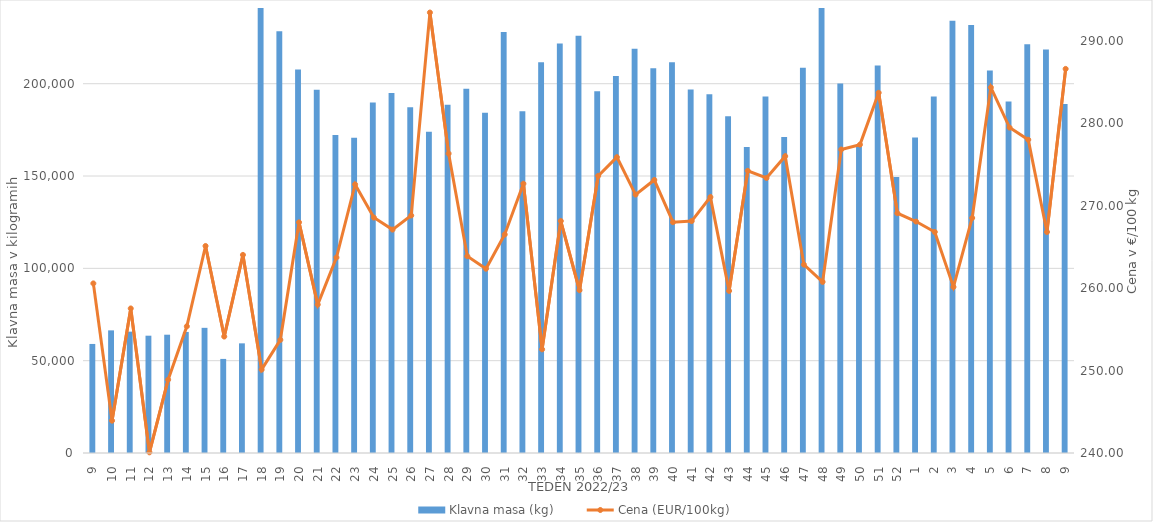
| Category | Klavna masa (kg) |
|---|---|
| 9.0 | 59056 |
| 10.0 | 66417 |
| 11.0 | 65723 |
| 12.0 | 63530 |
| 13.0 | 64069 |
| 14.0 | 65564 |
| 15.0 | 67787 |
| 16.0 | 50958 |
| 17.0 | 59387 |
| 18.0 | 241833 |
| 19.0 | 228389 |
| 20.0 | 207661 |
| 21.0 | 196732 |
| 22.0 | 172190 |
| 23.0 | 170751 |
| 24.0 | 189775 |
| 25.0 | 195029 |
| 26.0 | 187239 |
| 27.0 | 173967 |
| 28.0 | 188601 |
| 29.0 | 197293 |
| 30.0 | 184259 |
| 31.0 | 228023 |
| 32.0 | 185079 |
| 33.0 | 211612 |
| 34.0 | 221748 |
| 35.0 | 225927 |
| 36.0 | 195924 |
| 37.0 | 204224 |
| 38.0 | 218966 |
| 39.0 | 208403 |
| 40.0 | 211635 |
| 41.0 | 196841 |
| 42.0 | 194271 |
| 43.0 | 182399 |
| 44.0 | 165696 |
| 45.0 | 193022 |
| 46.0 | 171172 |
| 47.0 | 208597 |
| 48.0 | 253151 |
| 49.0 | 200117 |
| 50.0 | 167119 |
| 51.0 | 209797 |
| 52.0 | 149439 |
| 1.0 | 170843 |
| 2.0 | 193093 |
| 3.0 | 234042 |
| 4.0 | 231737 |
| 5.0 | 207136 |
| 6.0 | 190311 |
| 7.0 | 221366 |
| 8.0 | 218470 |
| 9.0 | 189006 |